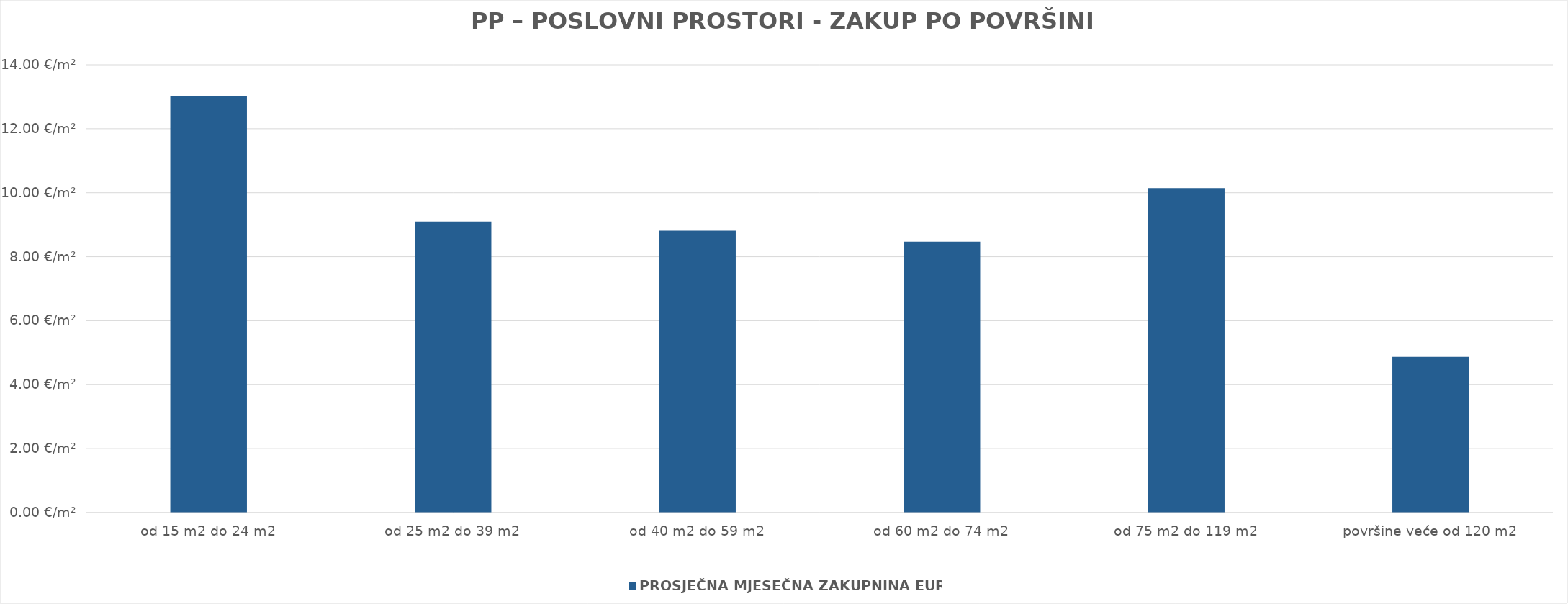
| Category | PROSJEČNA MJESEČNA ZAKUPNINA EUR/m2 |
|---|---|
| od 15 m2 do 24 m2 | 1900-01-13 00:29:40 |
| od 25 m2 do 39 m2 | 1900-01-09 02:24:46 |
| od 40 m2 do 59 m2 | 1900-01-08 19:27:13 |
| od 60 m2 do 74 m2 | 1900-01-08 11:10:59 |
| od 75 m2 do 119 m2 | 1900-01-10 03:32:26 |
| površine veće od 120 m2 | 1900-01-04 20:50:52 |